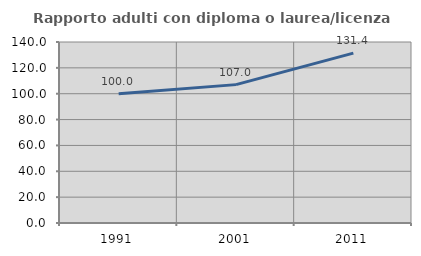
| Category | Rapporto adulti con diploma o laurea/licenza media  |
|---|---|
| 1991.0 | 100 |
| 2001.0 | 107.027 |
| 2011.0 | 131.429 |